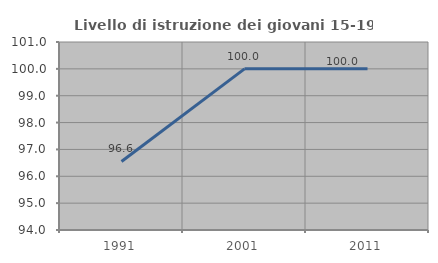
| Category | Livello di istruzione dei giovani 15-19 anni |
|---|---|
| 1991.0 | 96.552 |
| 2001.0 | 100 |
| 2011.0 | 100 |